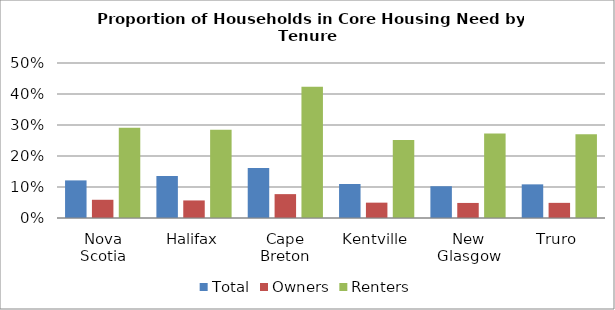
| Category | Total | Owners | Renters |
|---|---|---|---|
| Nova Scotia | 0.121 | 0.059 | 0.291 |
| Halifax | 0.136 | 0.057 | 0.284 |
| Cape Breton | 0.161 | 0.077 | 0.423 |
| Kentville | 0.11 | 0.05 | 0.252 |
| New Glasgow | 0.103 | 0.049 | 0.273 |
| Truro | 0.109 | 0.049 | 0.27 |